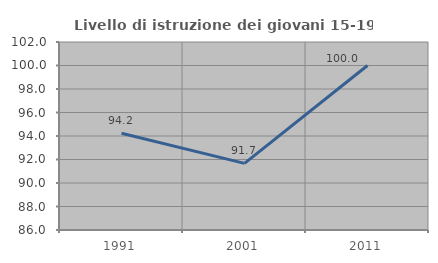
| Category | Livello di istruzione dei giovani 15-19 anni |
|---|---|
| 1991.0 | 94.231 |
| 2001.0 | 91.667 |
| 2011.0 | 100 |